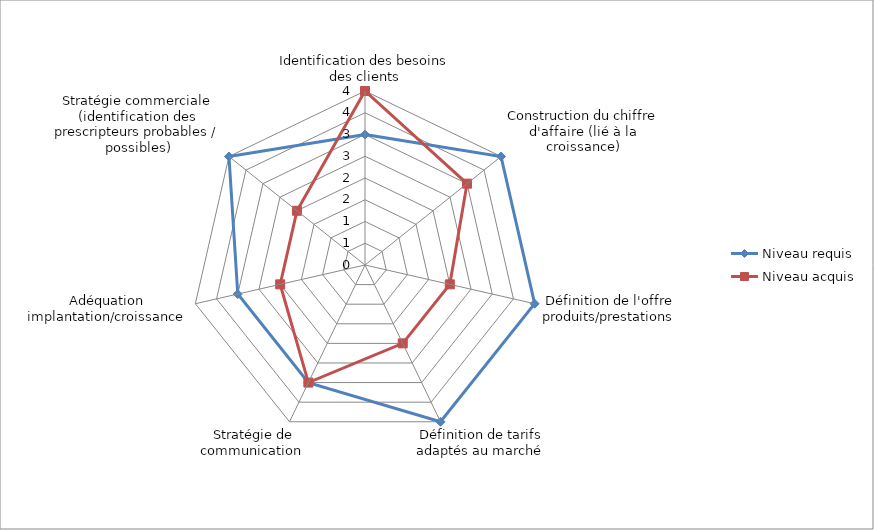
| Category | Niveau requis | Niveau acquis |
|---|---|---|
| Identification des besoins des clients | 3 | 4 |
| Construction du chiffre d'affaire (lié à la croissance) | 4 | 3 |
| Définition de l'offre produits/prestations | 4 | 2 |
| Définition de tarifs adaptés au marché | 4 | 2 |
| Stratégie de communication  | 3 | 3 |
| Adéquation implantation/croissance | 3 | 2 |
| Stratégie commerciale (identification des prescripteurs probables / possibles) | 4 | 2 |